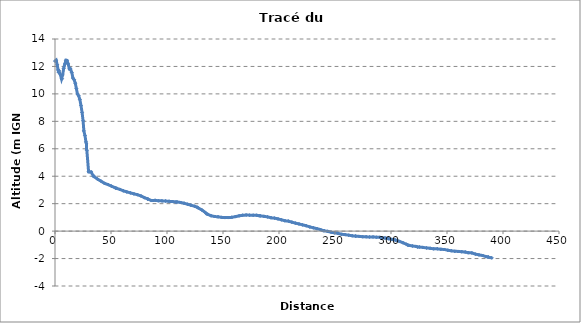
| Category | Series 0 |
|---|---|
| 0.0 | 12.394 |
| 1.0040542818911449 | 12.458 |
| 1.963000255166609 | 12.118 |
| 2.7408978457331687 | 11.749 |
| 3.2164853494957035 | 11.575 |
| 3.2968113389231655 | 11.725 |
| 3.852531635625858 | 11.529 |
| 4.84293599024182 | 11.383 |
| 5.803102963720951 | 11.088 |
| 6.34982598251248 | 11.1 |
| 6.824914652274639 | 11.378 |
| 7.749580956710577 | 11.848 |
| 8.771379367537458 | 12.177 |
| 9.740314009939574 | 12.45 |
| 10.740835396412262 | 12.438 |
| 11.770018606659391 | 12.182 |
| 12.813163387698069 | 11.818 |
| 13.82893524474481 | 11.823 |
| 15.001747698265143 | 11.555 |
| 16.014211751519017 | 11.153 |
| 17.104068346919448 | 11.028 |
| 18.138537813781724 | 10.776 |
| 19.07534033846487 | 10.382 |
| 20.05656812633671 | 9.99 |
| 21.16514857020522 | 9.858 |
| 22.205211483162252 | 9.584 |
| 23.208765693636806 | 9.153 |
| 24.173194782703337 | 8.645 |
| 25.085954636346823 | 8.04 |
| 25.759438212537038 | 7.305 |
| 26.742725758606394 | 6.972 |
| 27.632283601292336 | 6.498 |
| 28.07250186627568 | 6.353 |
| 28.13692467253226 | 5.981 |
| 28.428852422110474 | 5.89 |
| 29.99055481332694 | 4.325 |
| 30.845212481452286 | 4.32 |
| 32.29447884699667 | 4.312 |
| 34.349634831188936 | 3.99 |
| 34.76734723869017 | 4.009 |
| 37.87962956582867 | 3.796 |
| 40.977055483158104 | 3.646 |
| 44.20215421247984 | 3.483 |
| 47.216435242494285 | 3.395 |
| 50.35113461536875 | 3.278 |
| 53.37221936628088 | 3.175 |
| 54.21467366943689 | 3.117 |
| 54.947343785160186 | 3.123 |
| 58.02371411817444 | 3.037 |
| 61.05207955557431 | 2.936 |
| 64.13191767796515 | 2.858 |
| 67.40325378719862 | 2.785 |
| 70.47453538730649 | 2.715 |
| 73.60316554384589 | 2.654 |
| 76.7617494916641 | 2.56 |
| 79.88843646059766 | 2.436 |
| 82.76555041813533 | 2.344 |
| 82.79544205503801 | 2.341 |
| 82.7917491606273 | 2.341 |
| 86.11808648669489 | 2.228 |
| 89.37418584826081 | 2.242 |
| 92.42657644894939 | 2.212 |
| 95.5316947829304 | 2.204 |
| 98.7261414068348 | 2.192 |
| 101.82772039650163 | 2.171 |
| 105.03741452057227 | 2.154 |
| 107.99311234598319 | 2.124 |
| 108.94823758149518 | 2.126 |
| 112.04301257149586 | 2.088 |
| 115.29198238395946 | 2.03 |
| 118.29338849278176 | 1.959 |
| 121.4241687397387 | 1.885 |
| 124.7020246833813 | 1.811 |
| 126.80206443584184 | 1.746 |
| 127.92313389338027 | 1.689 |
| 131.17458443304432 | 1.54 |
| 134.17411327839017 | 1.36 |
| 135.38934745838415 | 1.258 |
| 136.26806318833175 | 1.232 |
| 139.31764866326114 | 1.12 |
| 142.4864920477606 | 1.065 |
| 145.56729793482862 | 1.043 |
| 148.66837739098568 | 1.002 |
| 151.70488261805116 | 0.986 |
| 154.70284089255523 | 0.987 |
| 157.92165034973144 | 1.005 |
| 161.1573579246665 | 1.056 |
| 164.39283539444804 | 1.114 |
| 167.53484786776417 | 1.157 |
| 170.63923777734342 | 1.169 |
| 173.7071346664178 | 1.163 |
| 176.91159196121495 | 1.16 |
| 179.94017068519116 | 1.157 |
| 182.39096427200332 | 1.119 |
| 183.42143327668623 | 1.111 |
| 186.58174008468487 | 1.076 |
| 189.7826355918854 | 1.035 |
| 192.8854191201453 | 0.972 |
| 195.9517458208776 | 0.945 |
| 199.11325909167581 | 0.89 |
| 202.27327436983023 | 0.823 |
| 205.33306536482183 | 0.754 |
| 208.36021613853018 | 0.727 |
| 211.52147178054554 | 0.652 |
| 214.599512716568 | 0.583 |
| 217.8280353359795 | 0.521 |
| 221.04173573810095 | 0.455 |
| 224.2591775693974 | 0.393 |
| 227.54537698952637 | 0.303 |
| 230.70444948691855 | 0.241 |
| 233.88624124777334 | 0.178 |
| 236.99425831446123 | 0.114 |
| 239.5395951320215 | 0.032 |
| 240.3719432904596 | 0.034 |
| 243.42437930968137 | -0.018 |
| 246.54935916574243 | -0.082 |
| 249.59744664804919 | -0.125 |
| 252.70230106832153 | -0.165 |
| 255.72530694555024 | -0.229 |
| 258.96413409085085 | -0.254 |
| 262.2354150952821 | -0.299 |
| 265.3991523913354 | -0.339 |
| 268.44995574611175 | -0.373 |
| 268.44809061241557 | -0.359 |
| 271.59132326785243 | -0.386 |
| 274.77091257493106 | -0.41 |
| 277.813661602991 | -0.418 |
| 280.87453965463817 | -0.425 |
| 283.9575923362682 | -0.424 |
| 287.0174598769482 | -0.446 |
| 290.037883817321 | -0.455 |
| 291.3039990393228 | -0.487 |
| 291.60960739497915 | -0.483 |
| 294.60651812205344 | -0.497 |
| 297.71863813417986 | -0.556 |
| 300.90158435122663 | -0.602 |
| 302.8574055575451 | -0.631 |
| 304.1771740370879 | -0.655 |
| 307.44452833039645 | -0.747 |
| 310.6871448553353 | -0.847 |
| 313.7121002788138 | -0.958 |
| 314.9952721587261 | -1.018 |
| 315.94603445905614 | -1.035 |
| 319.11473237236044 | -1.083 |
| 322.27653672769236 | -1.117 |
| 323.83437161772764 | -1.159 |
| 325.3845444538036 | -1.159 |
| 328.5398806739108 | -1.189 |
| 331.7843617854438 | -1.224 |
| 334.8579493656817 | -1.252 |
| 338.09495573307015 | -1.291 |
| 341.37970201255473 | -1.29 |
| 344.53381517815404 | -1.325 |
| 347.6377558975703 | -1.338 |
| 350.74339060384676 | -1.394 |
| 353.8595547688595 | -1.433 |
| 356.97571820089354 | -1.47 |
| 360.0924833947559 | -1.481 |
| 363.18912486648435 | -1.503 |
| 366.25194909036935 | -1.525 |
| 368.66553700758516 | -1.569 |
| 369.18560317727315 | -1.571 |
| 372.1993304305927 | -1.588 |
| 375.3673184830365 | -1.678 |
| 378.49858525100757 | -1.73 |
| 381.72461178373726 | -1.776 |
| 384.75898824729074 | -1.856 |
| 386.5990072485586 | -1.894 |
| 386.75822447164273 | -1.877 |
| 390.02698665638434 | -1.95 |